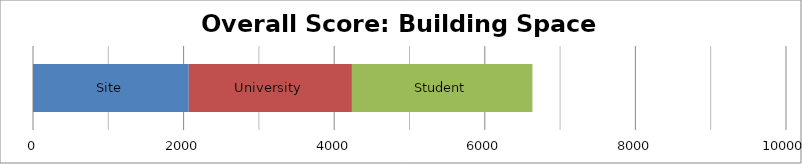
| Category | Site | University | Student |
|---|---|---|---|
| 0 | 2067.75 | 2167.5 | 2397.5 |